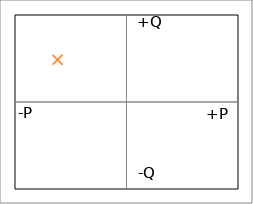
| Category | Q (VAr) |
|---|---|
| -3092.32932485377 | 2428.816 |